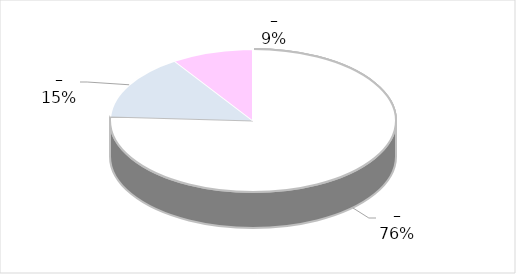
| Category | Series 0 |
|---|---|
| 0 | 41 |
| 1 | 8 |
| 2 | 5 |